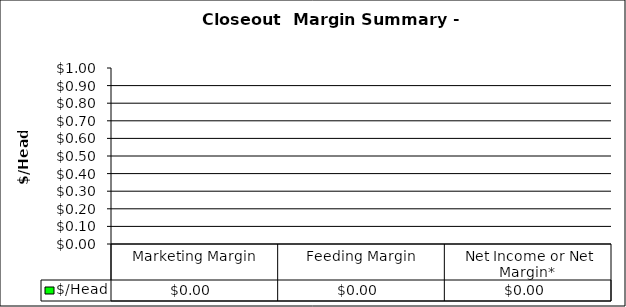
| Category | $/Head  |
|---|---|
| Marketing Margin | 0 |
| Feeding Margin | 0 |
| Net Income or Net Margin*  | 0 |